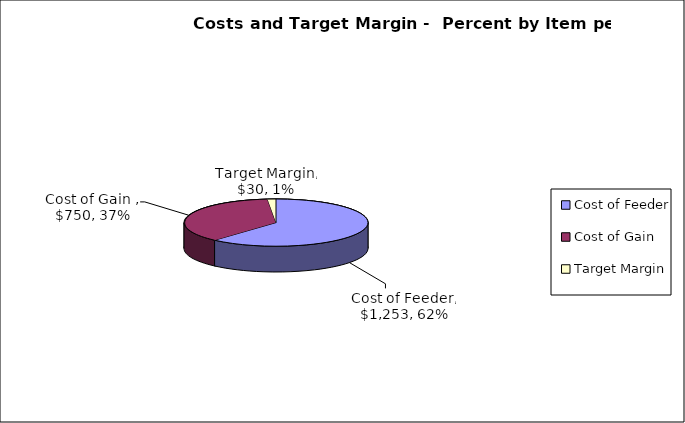
| Category | Series 0 |
|---|---|
| Cost of Feeder | 1252.525 |
| Cost of Gain  | 749.785 |
| Target Margin | 30 |